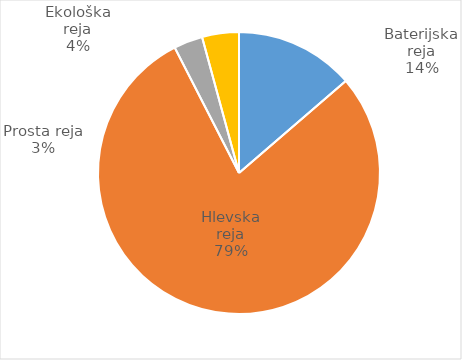
| Category | Število kosov jajc |
|---|---|
| Baterijska reja | 345341 |
| Hlevska reja | 1989846 |
| Prosta reja | 83779 |
| Ekološka reja | 106600 |